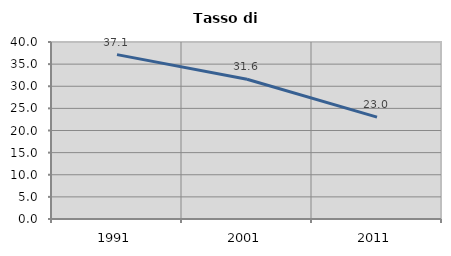
| Category | Tasso di disoccupazione   |
|---|---|
| 1991.0 | 37.143 |
| 2001.0 | 31.58 |
| 2011.0 | 23.015 |